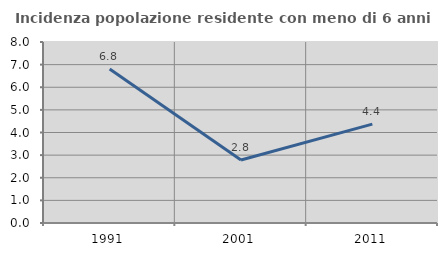
| Category | Incidenza popolazione residente con meno di 6 anni |
|---|---|
| 1991.0 | 6.802 |
| 2001.0 | 2.782 |
| 2011.0 | 4.37 |